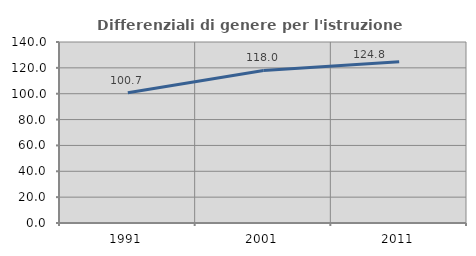
| Category | Differenziali di genere per l'istruzione superiore |
|---|---|
| 1991.0 | 100.739 |
| 2001.0 | 117.992 |
| 2011.0 | 124.756 |